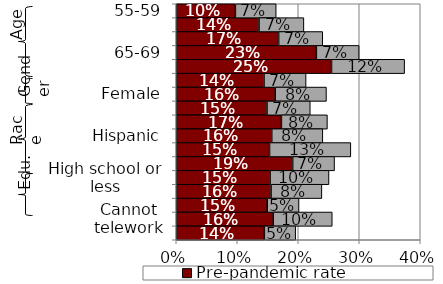
| Category | Pre-pandemic rate | Post-pandemic increase |
|---|---|---|
| 55-59 | 0.097 | 0.067 |
| 60-61 | 0.136 | 0.074 |
| 62-64 | 0.168 | 0.072 |
| 65-69 | 0.23 | 0.07 |
| 70+ | 0.255 | 0.12 |
| Male | 0.144 | 0.069 |
| Female | 0.162 | 0.084 |
| White non-Hispanic | 0.149 | 0.071 |
| Black non-Hispanic | 0.172 | 0.075 |
| Hispanic | 0.157 | 0.084 |
| Asian | 0.153 | 0.133 |
| Other race | 0.191 | 0.069 |
| High school or less | 0.154 | 0.097 |
| Some college | 0.155 | 0.083 |
| College + | 0.149 | 0.052 |
| Cannot telework | 0.159 | 0.097 |
| Can telework | 0.144 | 0.051 |